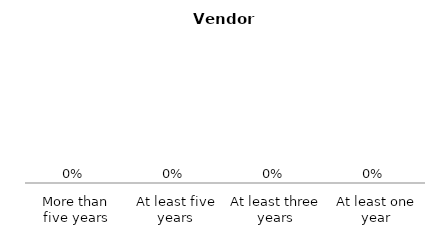
| Category | Series 0 |
|---|---|
| At least one year | 0 |
| At least three years | 0 |
| At least five years | 0 |
| More than five years | 0 |